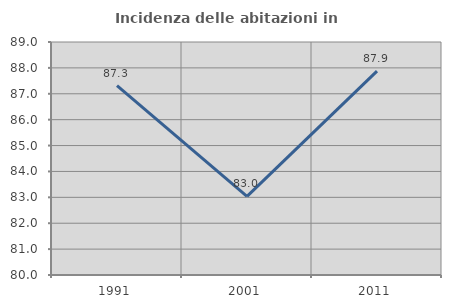
| Category | Incidenza delle abitazioni in proprietà  |
|---|---|
| 1991.0 | 87.316 |
| 2001.0 | 83.036 |
| 2011.0 | 87.873 |